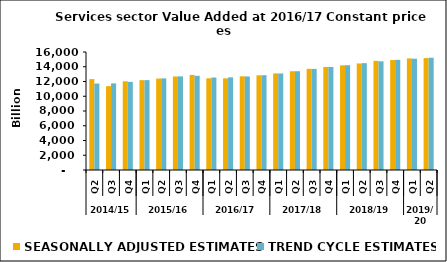
| Category | SEASONALLY ADJUSTED ESTIMATES | TREND CYCLE ESTIMATES |
|---|---|---|
| 0 | 12323.25 | 11719.777 |
| 1 | 11372.299 | 11747.68 |
| 2 | 12028.776 | 11947.584 |
| 3 | 12184.134 | 12185.451 |
| 4 | 12401.384 | 12422.427 |
| 5 | 12683.569 | 12692.889 |
| 6 | 12895.458 | 12771.614 |
| 7 | 12433.117 | 12542.974 |
| 8 | 12424.026 | 12562.153 |
| 9 | 12705.706 | 12680.507 |
| 10 | 12838.102 | 12855.475 |
| 11 | 13091.403 | 13087.719 |
| 12 | 13396.215 | 13398.377 |
| 13 | 13716.755 | 13708.009 |
| 14 | 13965.17 | 13965.794 |
| 15 | 14190.906 | 14206.557 |
| 16 | 14443.066 | 14489.127 |
| 17 | 14804.131 | 14734.629 |
| 18 | 14907.824 | 14937.423 |
| 19 | 15131.682 | 15091.416 |
| 20 | 15175.18 | 15221.031 |